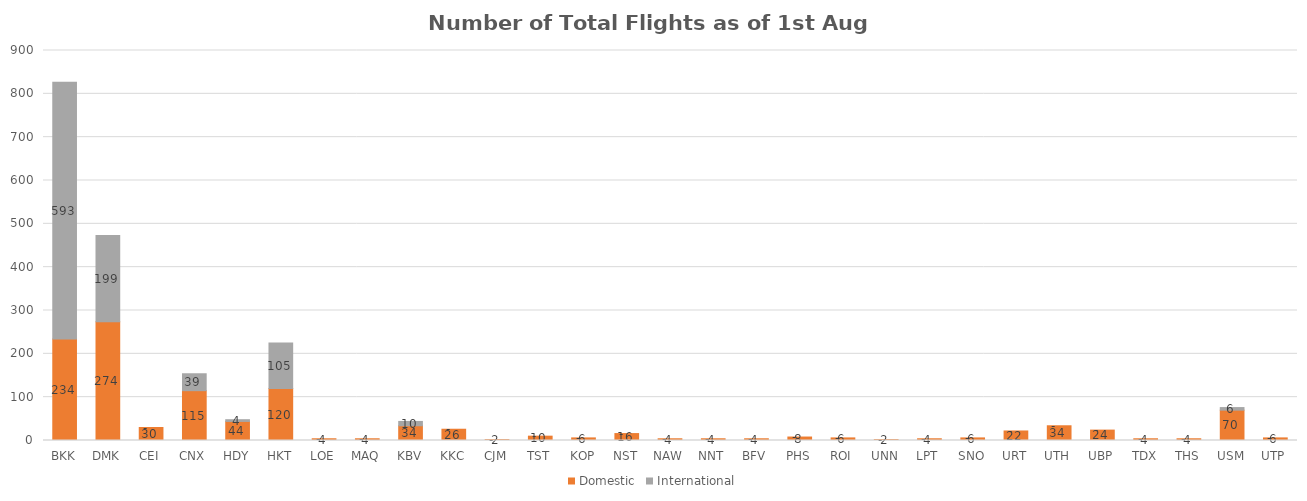
| Category | Domestic | International |
|---|---|---|
| BKK | 234 | 593 |
| DMK | 274 | 199 |
| CEI | 30 | 0 |
| CNX | 115 | 39 |
| HDY | 44 | 4 |
| HKT | 120 | 105 |
| LOE | 4 | 0 |
| MAQ | 4 | 0 |
| KBV | 34 | 10 |
| KKC | 26 | 0 |
| CJM | 2 | 0 |
| TST | 10 | 0 |
| KOP | 6 | 0 |
| NST | 16 | 0 |
| NAW | 4 | 0 |
| NNT | 4 | 0 |
| BFV | 4 | 0 |
| PHS | 8 | 0 |
| ROI | 6 | 0 |
| UNN | 2 | 0 |
| LPT | 4 | 0 |
| SNO | 6 | 0 |
| URT | 22 | 0 |
| UTH | 34 | 0 |
| UBP | 24 | 0 |
| TDX | 4 | 0 |
| THS | 4 | 0 |
| USM | 70 | 6 |
| UTP | 6 | 0 |